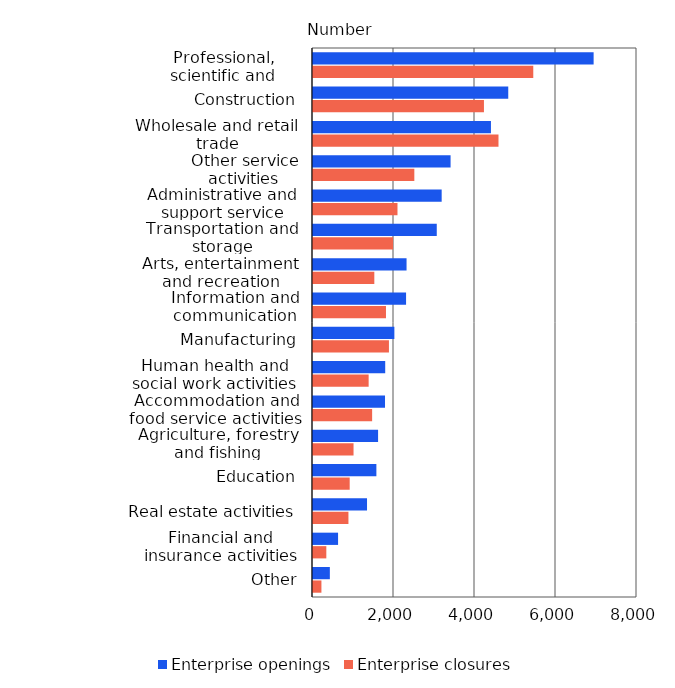
| Category | Enterprise openings | Enterprise closures |
|---|---|---|
| Professional, scientific and technical activities | 6929 | 5439 |
| Construction | 4821 | 4221 |
| Wholesale and retail trade | 4394 | 4580 |
| Other service activities | 3397 | 2502 |
| Administrative and support service activities | 3177 | 2086 |
| Transportation and storage | 3056 | 1977 |
| Arts, entertainment and recreation | 2310 | 1514 |
| Information and communication | 2298 | 1802 |
| Manufacturing | 2009 | 1875 |
| Human health and social work activities | 1783 | 1374 |
| Accommodation and food service activities | 1778 | 1460 |
| Agriculture, forestry and fishing | 1607 | 1001 |
| Education | 1565 | 906 |
| Real estate activities | 1334 | 875 |
| Financial and insurance activities | 619 | 329 |
| Other | 416 | 208 |